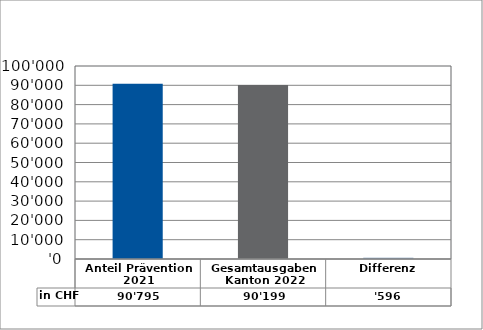
| Category | in CHF |
|---|---|
| Anteil Prävention 2021

 | 90795.25 |
| Gesamtausgaben Kanton 2022
 | 90198.8 |
| Differenz | 596.45 |